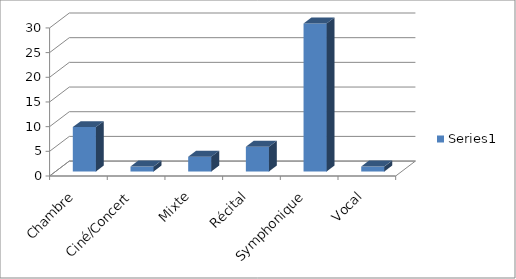
| Category | Series 0 |
|---|---|
| Chambre | 9 |
| Ciné/Concert | 1 |
| Mixte | 3 |
| Récital | 5 |
| Symphonique | 30 |
| Vocal | 1 |